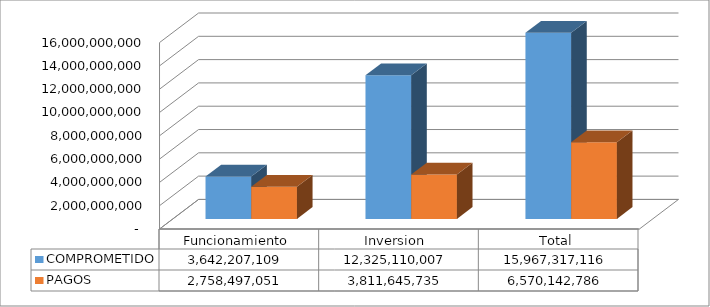
| Category | COMPROMETIDO | PAGOS |
|---|---|---|
| Funcionamiento | 3642207109 | 2758497051 |
| Inversion  | 12325110007 | 3811645735 |
| Total | 15967317116 | 6570142786 |